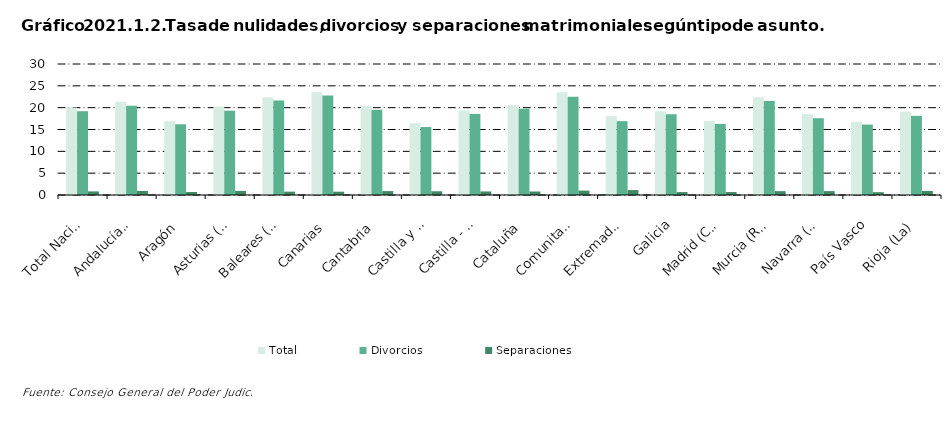
| Category | Total | Divorcios | Separaciones |
|---|---|---|---|
| Total Nacional | 20.033 | 19.188 | 0.829 |
| Andalucía(1) | 21.372 | 20.419 | 0.932 |
| Aragón | 16.918 | 16.203 | 0.685 |
| Asturias (Principado de) | 20.24 | 19.307 | 0.932 |
| Baleares (Illes) | 22.406 | 21.63 | 0.768 |
| Canarias | 23.594 | 22.804 | 0.763 |
| Cantabria | 20.432 | 19.54 | 0.892 |
| Castilla y León | 16.426 | 15.562 | 0.856 |
| Castilla - La Mancha | 19.392 | 18.565 | 0.817 |
| Cataluña | 20.568 | 19.753 | 0.802 |
| Comunitat Valenciana | 23.508 | 22.478 | 1.008 |
| Extremadura | 18.036 | 16.908 | 1.128 |
| Galicia | 19.18 | 18.499 | 0.674 |
| Madrid (Comunidad de) | 16.969 | 16.269 | 0.678 |
| Murcia (Región de) | 22.392 | 21.505 | 0.88 |
| Navarra (Comunidad Foral de) | 18.527 | 17.589 | 0.892 |
| País Vasco | 16.775 | 16.122 | 0.644 |
| Rioja (La) | 19.099 | 18.13 | 0.938 |